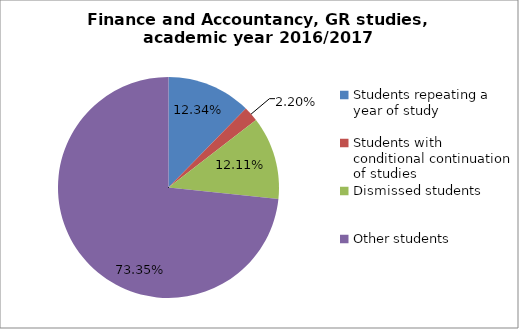
| Category | Series 0 |
|---|---|
| Students repeating a year of study | 56 |
| Students with conditional continuation of studies | 10 |
| Dismissed students | 55 |
| Other students | 333 |